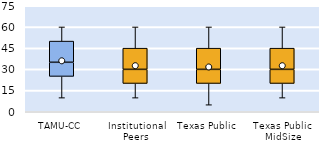
| Category | 25th | 50th | 75th |
|---|---|---|---|
| TAMU-CC | 25 | 10 | 15 |
| Institutional Peers | 20 | 10 | 15 |
| Texas Public | 20 | 10 | 15 |
| Texas Public MidSize | 20 | 10 | 15 |